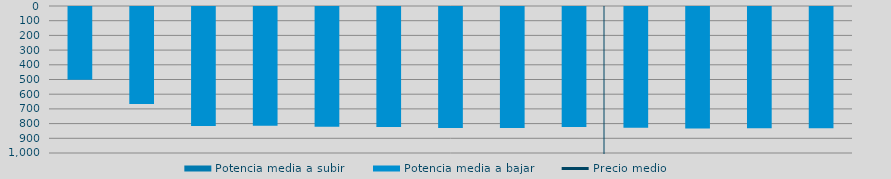
| Category | Potencia media a subir | Potencia media a bajar |
|---|---|---|
| 0 |  | 494.972 |
| 1 |  | 659.7 |
| 2 |  | 809.502 |
| 3 |  | 808.05 |
| 4 |  | 814.726 |
| 5 |  | 815.741 |
| 6 |  | 822.445 |
| 7 |  | 823.829 |
| 8 |  | 816.372 |
| 9 |  | 821.408 |
| 10 |  | 825.952 |
| 11 |  | 824.183 |
| 12 |  | 824.381 |